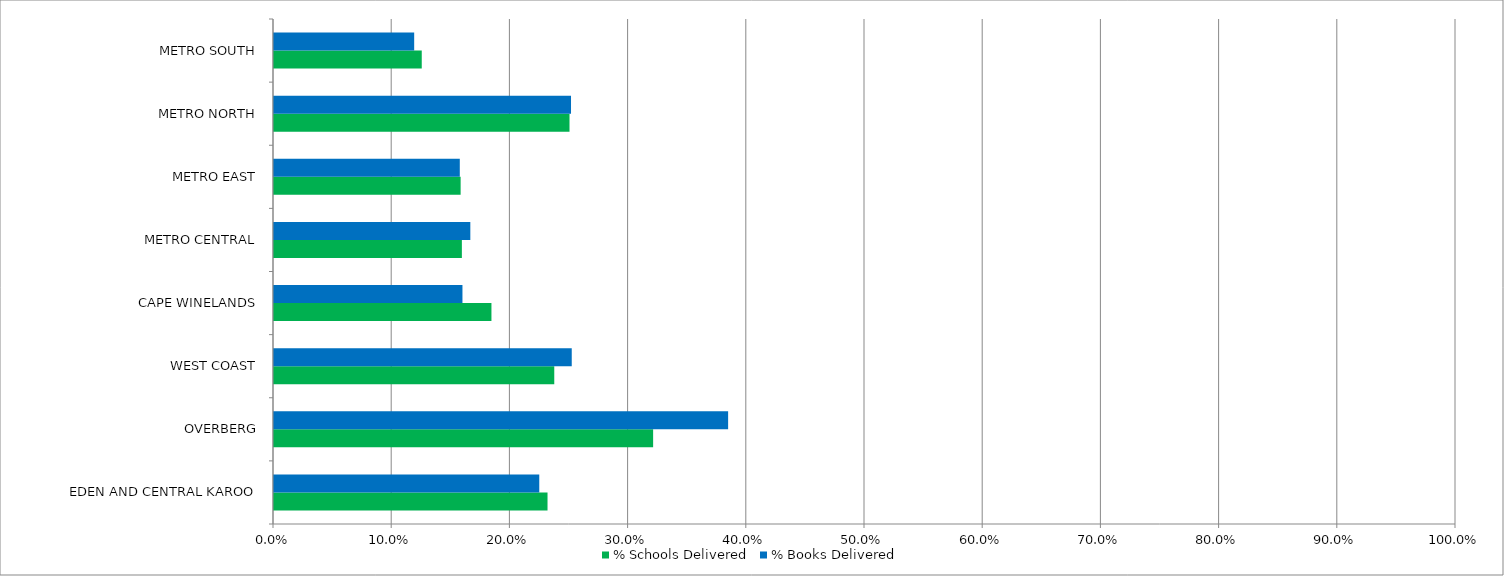
| Category | % Schools Delivered | % Books Delivered |
|---|---|---|
| EDEN AND CENTRAL KAROO | 0.231 | 0.224 |
| OVERBERG | 0.321 | 0.384 |
| WEST COAST | 0.237 | 0.252 |
| CAPE WINELANDS | 0.184 | 0.159 |
| METRO CENTRAL | 0.159 | 0.166 |
| METRO EAST | 0.158 | 0.157 |
| METRO NORTH | 0.25 | 0.251 |
| METRO SOUTH | 0.125 | 0.119 |